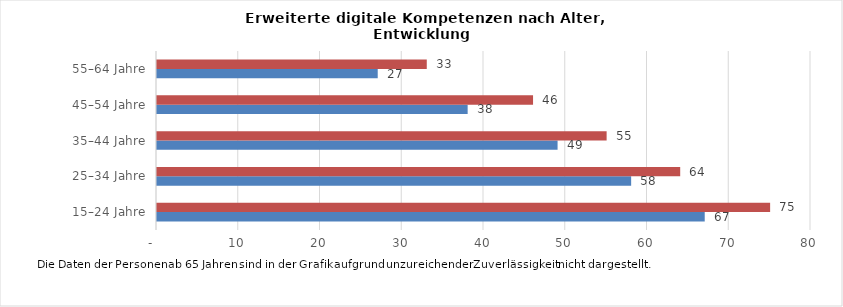
| Category | 2017 | 2019 |
|---|---|---|
| 15–24 Jahre | 67 | 75 |
| 25–34 Jahre | 58 | 64 |
| 35–44 Jahre | 49 | 55 |
| 45–54 Jahre | 38 | 46 |
| 55–64 Jahre | 27 | 33 |